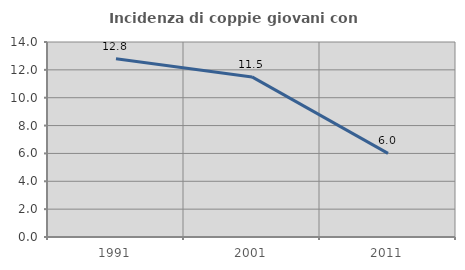
| Category | Incidenza di coppie giovani con figli |
|---|---|
| 1991.0 | 12.795 |
| 2001.0 | 11.494 |
| 2011.0 | 6 |